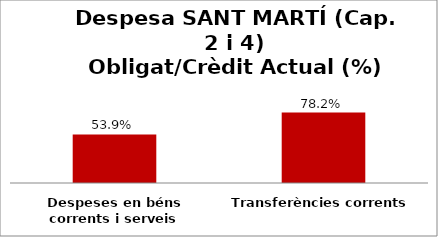
| Category | Series 0 |
|---|---|
| Despeses en béns corrents i serveis | 0.539 |
| Transferències corrents | 0.782 |